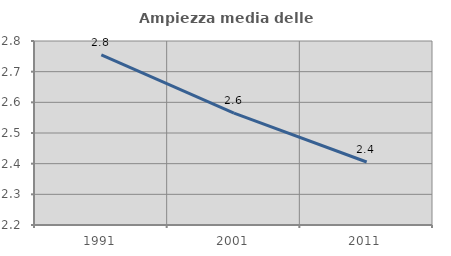
| Category | Ampiezza media delle famiglie |
|---|---|
| 1991.0 | 2.755 |
| 2001.0 | 2.565 |
| 2011.0 | 2.405 |